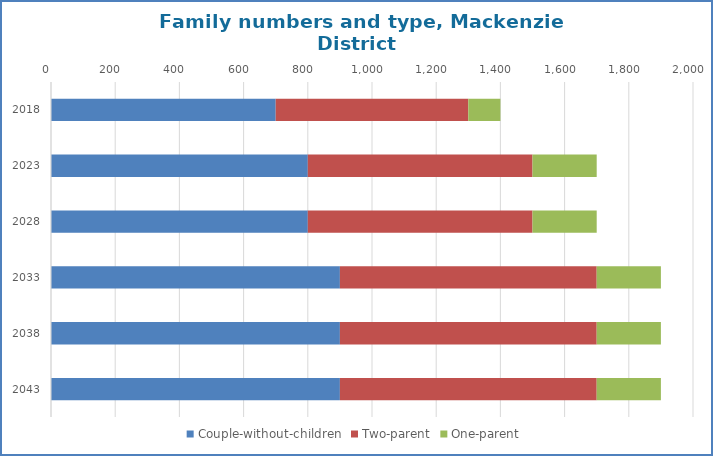
| Category | Couple-without-children | Two-parent | One-parent |
|---|---|---|---|
| 2018.0 | 700 | 600 | 100 |
| 2023.0 | 800 | 700 | 200 |
| 2028.0 | 800 | 700 | 200 |
| 2033.0 | 900 | 800 | 200 |
| 2038.0 | 900 | 800 | 200 |
| 2043.0 | 900 | 800 | 200 |